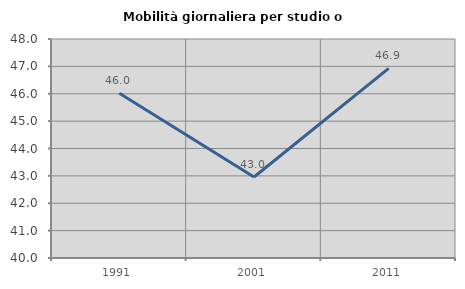
| Category | Mobilità giornaliera per studio o lavoro |
|---|---|
| 1991.0 | 46.015 |
| 2001.0 | 42.959 |
| 2011.0 | 46.929 |